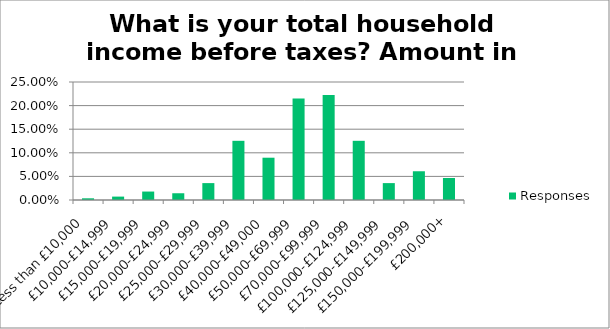
| Category | Responses |
|---|---|
| Less than £10,000 | 0.004 |
| £10,000-£14,999 | 0.007 |
| £15,000-£19,999 | 0.018 |
| £20,000-£24,999 | 0.014 |
| £25,000-£29,999 | 0.036 |
| £30,000-£39,999 | 0.125 |
| £40,000-£49,000 | 0.09 |
| £50,000-£69,999 | 0.215 |
| £70,000-£99,999 | 0.222 |
| £100,000-£124,999 | 0.125 |
| £125,000-£149,999 | 0.036 |
| £150,000-£199,999 | 0.061 |
| £200,000+ | 0.047 |